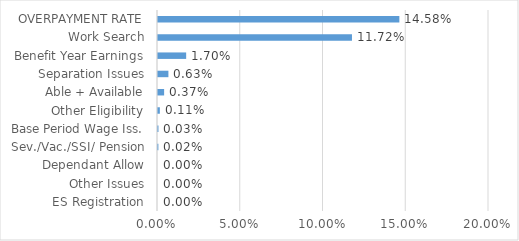
| Category | Series 0 |
|---|---|
| ES Registration | 0 |
| Other Issues | 0 |
| Dependant Allow | 0 |
| Sev./Vac./SSI/ Pension | 0 |
| Base Period Wage Iss. | 0 |
| Other Eligibility | 0.001 |
| Able + Available | 0.004 |
| Separation Issues | 0.006 |
| Benefit Year Earnings | 0.017 |
| Work Search | 0.117 |
| OVERPAYMENT RATE | 0.146 |